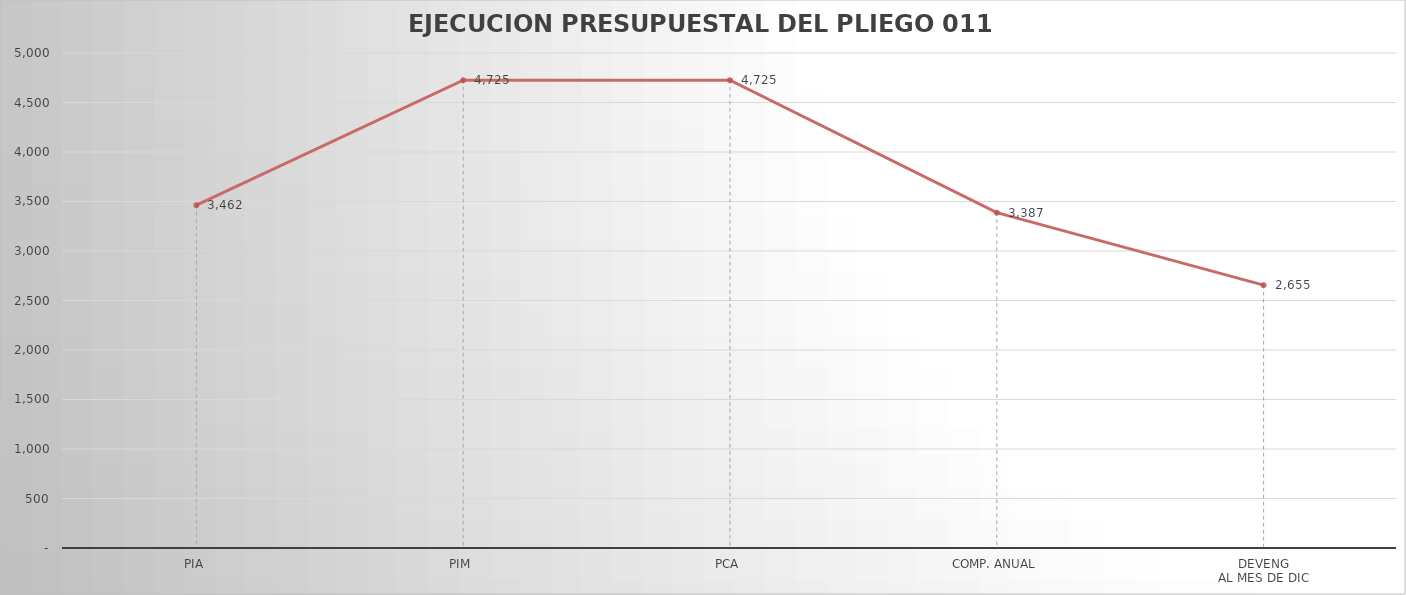
| Category | Series 0 |
|---|---|
| PIA | 3462.391 |
| PIM | 4724.751 |
| PCA | 4724.751 |
| COMP. ANUAL | 3387.105 |
| DEVENG
AL MES DE DIC | 2654.859 |